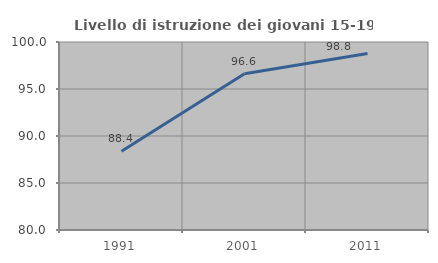
| Category | Livello di istruzione dei giovani 15-19 anni |
|---|---|
| 1991.0 | 88.379 |
| 2001.0 | 96.619 |
| 2011.0 | 98.778 |